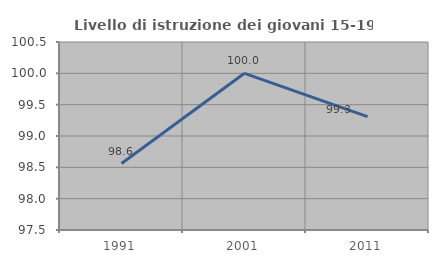
| Category | Livello di istruzione dei giovani 15-19 anni |
|---|---|
| 1991.0 | 98.561 |
| 2001.0 | 100 |
| 2011.0 | 99.31 |